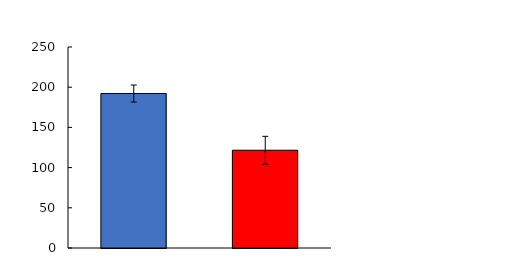
| Category | Series 0 |
|---|---|
| Veh | 192.108 |
| DT | 121.586 |